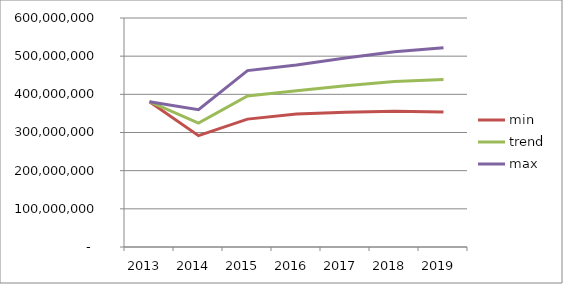
| Category |  min  |  trend  |  max  |
|---|---|---|---|
| 2013.0 | 380771377.679 | 380771377.679 | 380771377.679 |
| 2014.0 | 291769483.243 | 324483463.009 | 359893614.936 |
| 2015.0 | 335028711.986 | 395766151.101 | 462153046.889 |
| 2016.0 | 348725899.757 | 409655841.995 | 476953661.726 |
| 2017.0 | 353200669.314 | 422717312.247 | 494946090.808 |
| 2018.0 | 355632270.814 | 433422048.607 | 511326765.829 |
| 2019.0 | 353550713.341 | 438614811.882 | 522111996.054 |